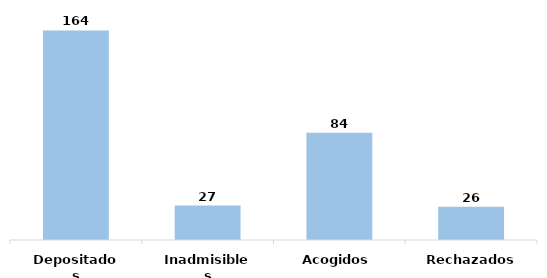
| Category | Series 0 |
|---|---|
| Depositados | 164 |
| Inadmisibles | 27 |
| Acogidos | 84 |
| Rechazados | 26 |